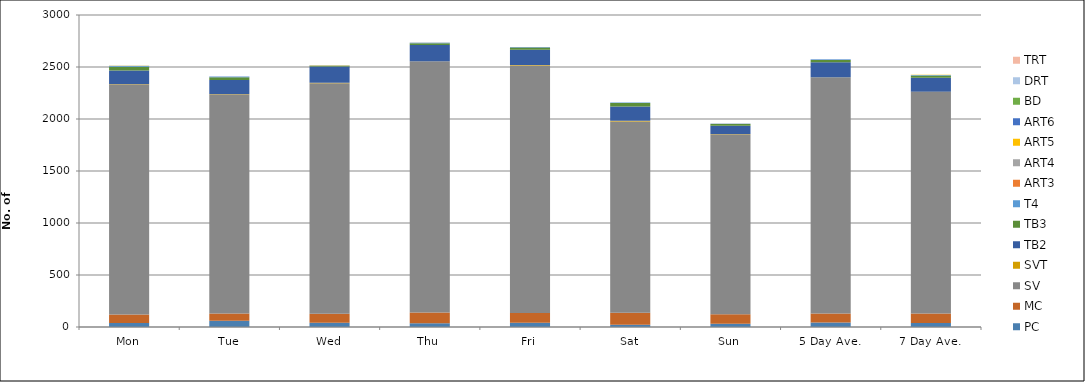
| Category | PC | MC | SV | SVT | TB2 | TB3 | T4 | ART3 | ART4 | ART5 | ART6 | BD | DRT | TRT |
|---|---|---|---|---|---|---|---|---|---|---|---|---|---|---|
| Mon | 38 | 82 | 2214 | 2 | 130 | 37 | 7 | 0 | 0 | 2 | 1 | 0 | 1 | 0 |
| Tue | 59 | 70 | 2110 | 2 | 135 | 25 | 5 | 0 | 0 | 1 | 1 | 0 | 0 | 0 |
| Wed | 41 | 86 | 2216 | 5 | 157 | 7 | 2 | 0 | 0 | 2 | 0 | 0 | 0 | 0 |
| Thu | 37 | 103 | 2415 | 1 | 155 | 18 | 4 | 1 | 2 | 0 | 0 | 0 | 0 | 0 |
| Fri | 42 | 93 | 2380 | 4 | 147 | 22 | 1 | 0 | 1 | 0 | 3 | 0 | 0 | 0 |
| Sat | 22 | 114 | 1839 | 7 | 138 | 34 | 4 | 0 | 0 | 0 | 0 | 0 | 0 | 0 |
| Sun | 31 | 92 | 1731 | 2 | 78 | 17 | 4 | 0 | 1 | 0 | 1 | 0 | 0 | 0 |
| 5 Day Ave. | 43 | 87 | 2267 | 3 | 145 | 22 | 4 | 0 | 1 | 1 | 1 | 0 | 0 | 0 |
| 7 Day Ave. | 39 | 91 | 2129 | 3 | 134 | 23 | 4 | 0 | 1 | 1 | 1 | 0 | 0 | 0 |